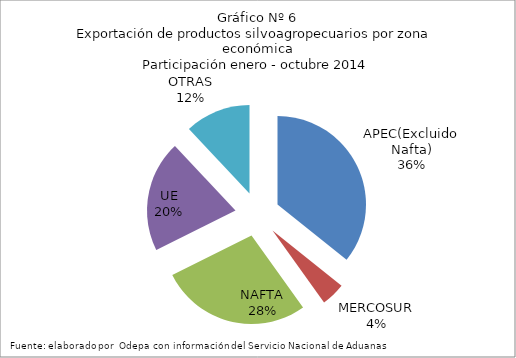
| Category | Series 0 |
|---|---|
| APEC(Excluido Nafta) | 4813539.208 |
| MERCOSUR | 585754.397 |
| NAFTA | 3708282.158 |
| UE | 2740499.544 |
| OTRAS | 1615722.693 |